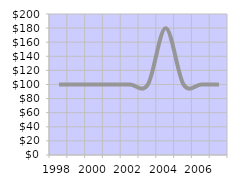
| Category | Total Number
 of Employees  |
|---|---|
| 1998.0 | 100 |
| 1999.0 | 100 |
| 2000.0 | 100 |
| 2001.0 | 100 |
| 2002.0 | 100 |
| 2003.0 | 100 |
| 2004.0 | 180 |
| 2005.0 | 100 |
| 2006.0 | 100 |
| 2007.0 | 100 |